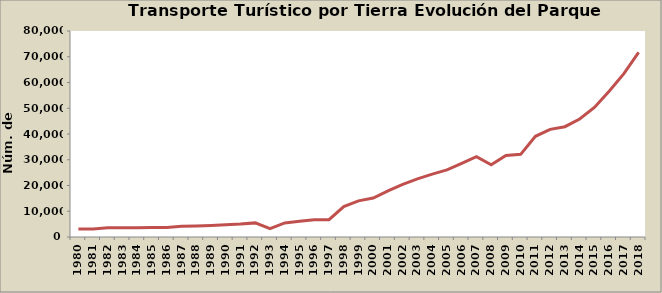
| Category | Series 0 |
|---|---|
| 1980.0 | 3070 |
| 1981.0 | 3150 |
| 1982.0 | 3550 |
| 1983.0 | 3589 |
| 1984.0 | 3596 |
| 1985.0 | 3674 |
| 1986.0 | 3718 |
| 1987.0 | 4127 |
| 1988.0 | 4266 |
| 1989.0 | 4476 |
| 1990.0 | 4782 |
| 1991.0 | 5005 |
| 1992.0 | 5481 |
| 1993.0 | 3240 |
| 1994.0 | 5476 |
| 1995.0 | 6137 |
| 1996.0 | 6706 |
| 1997.0 | 6729 |
| 1998.0 | 11793 |
| 1999.0 | 14048 |
| 2000.0 | 15124 |
| 2001.0 | 17889 |
| 2002.0 | 20424 |
| 2003.0 | 22561 |
| 2004.0 | 24419 |
| 2005.0 | 26044 |
| 2006.0 | 28579 |
| 2007.0 | 31203 |
| 2008.0 | 28008 |
| 2009.0 | 31619 |
| 2010.0 | 32105 |
| 2011.0 | 39093 |
| 2012.0 | 41813 |
| 2013.0 | 42836 |
| 2014.0 | 45817 |
| 2015.0 | 50284 |
| 2016.0 | 56598 |
| 2017.0 | 63420 |
| 2018.0 | 71716 |